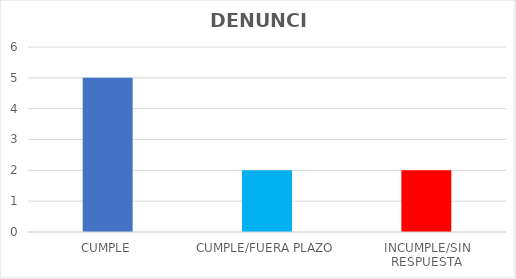
| Category | TOTAL |
|---|---|
| CUMPLE | 5 |
| CUMPLE/FUERA PLAZO | 2 |
| INCUMPLE/SIN RESPUESTA | 2 |